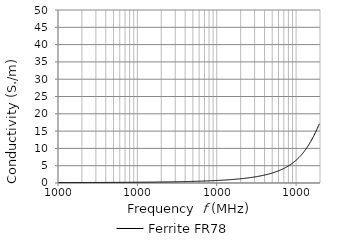
| Category | Ferrite FR78 |
|---|---|
| 10000.0 | 0.139 |
| 10192.3 | 0.14 |
| 10388.3 | 0.14 |
| 10588.1 | 0.14 |
| 10791.8 | 0.14 |
| 10999.3 | 0.14 |
| 11210.9 | 0.14 |
| 11426.5 | 0.141 |
| 11646.2 | 0.141 |
| 11870.2 | 0.141 |
| 12098.5 | 0.141 |
| 12331.2 | 0.141 |
| 12568.4 | 0.142 |
| 12810.1 | 0.142 |
| 13056.5 | 0.142 |
| 13307.6 | 0.142 |
| 13563.5 | 0.143 |
| 13824.4 | 0.143 |
| 14090.2 | 0.143 |
| 14361.2 | 0.143 |
| 14637.4 | 0.144 |
| 14919.0 | 0.144 |
| 15205.9 | 0.144 |
| 15498.3 | 0.144 |
| 15796.4 | 0.145 |
| 16100.2 | 0.145 |
| 16409.9 | 0.145 |
| 16725.5 | 0.146 |
| 17047.1 | 0.146 |
| 17375.0 | 0.146 |
| 17709.2 | 0.147 |
| 18049.7 | 0.147 |
| 18396.9 | 0.147 |
| 18750.7 | 0.148 |
| 19111.3 | 0.148 |
| 19478.9 | 0.148 |
| 19853.5 | 0.149 |
| 20235.3 | 0.149 |
| 20624.5 | 0.15 |
| 21021.2 | 0.15 |
| 21425.5 | 0.15 |
| 21837.5 | 0.151 |
| 22257.5 | 0.151 |
| 22685.6 | 0.152 |
| 23121.9 | 0.152 |
| 23566.6 | 0.153 |
| 24019.8 | 0.153 |
| 24481.8 | 0.154 |
| 24952.6 | 0.154 |
| 25432.5 | 0.155 |
| 25921.7 | 0.155 |
| 26420.2 | 0.156 |
| 26928.3 | 0.156 |
| 27446.2 | 0.157 |
| 27974.1 | 0.157 |
| 28512.1 | 0.158 |
| 29060.5 | 0.158 |
| 29619.4 | 0.159 |
| 30189.0 | 0.159 |
| 30769.6 | 0.16 |
| 31361.4 | 0.16 |
| 31964.6 | 0.161 |
| 32579.3 | 0.162 |
| 33205.9 | 0.162 |
| 33844.5 | 0.163 |
| 34495.4 | 0.164 |
| 35158.9 | 0.164 |
| 35835.1 | 0.165 |
| 36524.3 | 0.166 |
| 37226.7 | 0.166 |
| 37942.7 | 0.167 |
| 38672.4 | 0.168 |
| 39416.2 | 0.168 |
| 40174.3 | 0.169 |
| 40946.9 | 0.17 |
| 41734.4 | 0.171 |
| 42537.1 | 0.171 |
| 43355.2 | 0.172 |
| 44189.0 | 0.173 |
| 45038.9 | 0.174 |
| 45905.1 | 0.175 |
| 46787.9 | 0.175 |
| 47687.8 | 0.176 |
| 48604.9 | 0.177 |
| 49539.7 | 0.178 |
| 50492.5 | 0.179 |
| 51463.6 | 0.18 |
| 52453.4 | 0.181 |
| 53462.2 | 0.182 |
| 54490.4 | 0.183 |
| 55538.4 | 0.184 |
| 56606.5 | 0.185 |
| 57695.2 | 0.186 |
| 58804.8 | 0.187 |
| 59935.8 | 0.188 |
| 61088.5 | 0.189 |
| 62263.4 | 0.19 |
| 63460.9 | 0.191 |
| 64681.4 | 0.192 |
| 65925.4 | 0.193 |
| 67193.3 | 0.194 |
| 68485.6 | 0.195 |
| 69802.7 | 0.196 |
| 71145.2 | 0.198 |
| 72513.5 | 0.199 |
| 73908.1 | 0.2 |
| 75329.5 | 0.201 |
| 76778.3 | 0.202 |
| 78255.0 | 0.204 |
| 79760.0 | 0.205 |
| 81294.0 | 0.206 |
| 82857.5 | 0.207 |
| 84451.0 | 0.209 |
| 86075.2 | 0.21 |
| 87730.7 | 0.211 |
| 89417.9 | 0.213 |
| 91137.7 | 0.214 |
| 92890.5 | 0.216 |
| 94677.0 | 0.217 |
| 96497.9 | 0.219 |
| 98353.8 | 0.22 |
| 100245.0 | 0.221 |
| 102173.0 | 0.223 |
| 104138.0 | 0.224 |
| 106141.0 | 0.226 |
| 108183.0 | 0.228 |
| 110263.0 | 0.229 |
| 112384.0 | 0.231 |
| 114545.0 | 0.232 |
| 116748.0 | 0.234 |
| 118994.0 | 0.236 |
| 121282.0 | 0.238 |
| 123615.0 | 0.239 |
| 125992.0 | 0.241 |
| 128415.0 | 0.243 |
| 130885.0 | 0.245 |
| 133402.0 | 0.246 |
| 135968.0 | 0.249 |
| 138583.0 | 0.25 |
| 141248.0 | 0.252 |
| 143965.0 | 0.254 |
| 146734.0 | 0.256 |
| 149556.0 | 0.258 |
| 152432.0 | 0.26 |
| 155364.0 | 0.262 |
| 158352.0 | 0.264 |
| 161397.0 | 0.266 |
| 164501.0 | 0.269 |
| 167665.0 | 0.271 |
| 170890.0 | 0.273 |
| 174176.0 | 0.275 |
| 177526.0 | 0.277 |
| 180940.0 | 0.28 |
| 184420.0 | 0.282 |
| 187967.0 | 0.285 |
| 191582.0 | 0.287 |
| 195267.0 | 0.289 |
| 199022.0 | 0.292 |
| 202850.0 | 0.294 |
| 206751.0 | 0.297 |
| 210728.0 | 0.3 |
| 214780.0 | 0.302 |
| 218911.0 | 0.305 |
| 223121.0 | 0.307 |
| 227413.0 | 0.31 |
| 231786.0 | 0.313 |
| 236244.0 | 0.316 |
| 240788.0 | 0.319 |
| 245419.0 | 0.322 |
| 250139.0 | 0.324 |
| 254949.0 | 0.327 |
| 259853.0 | 0.33 |
| 264850.0 | 0.333 |
| 269944.0 | 0.337 |
| 275136.0 | 0.34 |
| 280427.0 | 0.343 |
| 285821.0 | 0.346 |
| 291318.0 | 0.349 |
| 296920.0 | 0.353 |
| 302631.0 | 0.356 |
| 308451.0 | 0.36 |
| 314383.0 | 0.363 |
| 320430.0 | 0.367 |
| 326593.0 | 0.37 |
| 332874.0 | 0.374 |
| 339276.0 | 0.378 |
| 345801.0 | 0.381 |
| 352451.0 | 0.385 |
| 359230.0 | 0.389 |
| 366139.0 | 0.393 |
| 373181.0 | 0.397 |
| 380358.0 | 0.401 |
| 387673.0 | 0.405 |
| 395129.0 | 0.409 |
| 402728.0 | 0.414 |
| 410474.0 | 0.418 |
| 418368.0 | 0.422 |
| 426414.0 | 0.427 |
| 434615.0 | 0.431 |
| 442974.0 | 0.436 |
| 451494.0 | 0.441 |
| 460177.0 | 0.445 |
| 469027.0 | 0.45 |
| 478048.0 | 0.455 |
| 487242.0 | 0.46 |
| 496613.0 | 0.465 |
| 506164.0 | 0.47 |
| 515899.0 | 0.475 |
| 525821.0 | 0.48 |
| 535934.0 | 0.486 |
| 546241.0 | 0.491 |
| 556746.0 | 0.497 |
| 567454.0 | 0.502 |
| 578368.0 | 0.508 |
| 589491.0 | 0.514 |
| 600828.0 | 0.52 |
| 612384.0 | 0.526 |
| 624162.0 | 0.532 |
| 636166.0 | 0.538 |
| 648401.0 | 0.544 |
| 660871.0 | 0.551 |
| 673581.0 | 0.557 |
| 686536.0 | 0.564 |
| 699740.0 | 0.571 |
| 713198.0 | 0.578 |
| 726914.0 | 0.585 |
| 740894.0 | 0.592 |
| 755144.0 | 0.599 |
| 769667.0 | 0.606 |
| 784470.0 | 0.614 |
| 799557.0 | 0.621 |
| 814934.0 | 0.629 |
| 830608.0 | 0.637 |
| 846582.0 | 0.645 |
| 862864.0 | 0.653 |
| 879459.0 | 0.662 |
| 896373.0 | 0.67 |
| 913613.0 | 0.679 |
| 931184.0 | 0.687 |
| 949093.0 | 0.696 |
| 967346.0 | 0.705 |
| 985951.0 | 0.715 |
| 1004910.0 | 0.726 |
| 1024240.0 | 0.736 |
| 1043940.0 | 0.746 |
| 1064020.0 | 0.756 |
| 1084480.0 | 0.766 |
| 1105340.0 | 0.777 |
| 1126600.0 | 0.787 |
| 1148260.0 | 0.798 |
| 1170350.0 | 0.809 |
| 1192860.0 | 0.82 |
| 1215800.0 | 0.832 |
| 1239180.0 | 0.844 |
| 1263010.0 | 0.856 |
| 1287300.0 | 0.868 |
| 1312060.0 | 0.88 |
| 1337300.0 | 0.892 |
| 1363010.0 | 0.905 |
| 1389230.0 | 0.919 |
| 1415950.0 | 0.932 |
| 1443180.0 | 0.945 |
| 1470940.0 | 0.959 |
| 1499230.0 | 0.973 |
| 1528060.0 | 0.988 |
| 1557450.0 | 1.003 |
| 1587400.0 | 1.018 |
| 1617930.0 | 1.033 |
| 1649050.0 | 1.049 |
| 1680760.0 | 1.065 |
| 1713090.0 | 1.081 |
| 1746040.0 | 1.098 |
| 1779620.0 | 1.115 |
| 1813840.0 | 1.132 |
| 1848730.0 | 1.15 |
| 1884280.0 | 1.168 |
| 1920520.0 | 1.186 |
| 1957460.0 | 1.205 |
| 1995110.0 | 1.224 |
| 2033480.0 | 1.244 |
| 2072580.0 | 1.264 |
| 2112450.0 | 1.284 |
| 2153070.0 | 1.305 |
| 2194480.0 | 1.326 |
| 2236690.0 | 1.348 |
| 2279700.0 | 1.37 |
| 2323550.0 | 1.392 |
| 2368240.0 | 1.415 |
| 2413780.0 | 1.439 |
| 2460210.0 | 1.463 |
| 2507520.0 | 1.487 |
| 2555750.0 | 1.512 |
| 2604900.0 | 1.538 |
| 2655000.0 | 1.564 |
| 2706060.0 | 1.591 |
| 2758110.0 | 1.618 |
| 2811150.0 | 1.646 |
| 2865220.0 | 1.675 |
| 2920320.0 | 1.704 |
| 2976490.0 | 1.733 |
| 3033730.0 | 1.764 |
| 3092080.0 | 1.796 |
| 3151550.0 | 1.828 |
| 3212160.0 | 1.86 |
| 3273940.0 | 1.893 |
| 3336900.0 | 1.928 |
| 3401080.0 | 1.963 |
| 3466490.0 | 1.998 |
| 3533160.0 | 2.035 |
| 3601110.0 | 2.072 |
| 3670370.0 | 2.11 |
| 3740960.0 | 2.149 |
| 3812910.0 | 2.19 |
| 3886240.0 | 2.231 |
| 3960980.0 | 2.273 |
| 4037160.0 | 2.316 |
| 4114810.0 | 2.36 |
| 4193950.0 | 2.406 |
| 4274610.0 | 2.452 |
| 4356820.0 | 2.5 |
| 4440610.0 | 2.548 |
| 4526010.0 | 2.599 |
| 4613060.0 | 2.65 |
| 4701780.0 | 2.703 |
| 4792210.0 | 2.757 |
| 4884370.0 | 2.812 |
| 4978310.0 | 2.869 |
| 5074060.0 | 2.927 |
| 5171640.0 | 2.987 |
| 5271110.0 | 3.049 |
| 5372480.0 | 3.112 |
| 5475810.0 | 3.178 |
| 5581120.0 | 3.245 |
| 5688460.0 | 3.314 |
| 5797870.0 | 3.384 |
| 5909370.0 | 3.456 |
| 6023030.0 | 3.531 |
| 6138860.0 | 3.607 |
| 6256930.0 | 3.686 |
| 6377270.0 | 3.767 |
| 6499920.0 | 3.85 |
| 6624930.0 | 3.935 |
| 6752340.0 | 4.024 |
| 6882200.0 | 4.114 |
| 7014570.0 | 4.207 |
| 7149470.0 | 4.304 |
| 7286980.0 | 4.403 |
| 7427120.0 | 4.506 |
| 7569960.0 | 4.611 |
| 7715550.0 | 4.719 |
| 7863940.0 | 4.831 |
| 8015190.0 | 4.947 |
| 8169340.0 | 5.067 |
| 8326450.0 | 5.19 |
| 8486590.0 | 5.315 |
| 8649810.0 | 5.444 |
| 8816170.0 | 5.577 |
| 8985730.0 | 5.716 |
| 9158540.0 | 5.86 |
| 9334690.0 | 6.009 |
| 9514210.0 | 6.163 |
| 9697200.0 | 6.321 |
| 9883700.0 | 6.483 |
| 10073800.0 | 6.651 |
| 10267500.0 | 6.824 |
| 10465000.0 | 7.002 |
| 10666300.0 | 7.186 |
| 10871400.0 | 7.374 |
| 11080500.0 | 7.571 |
| 11293600.0 | 7.773 |
| 11510800.0 | 7.982 |
| 11732200.0 | 8.197 |
| 11957800.0 | 8.419 |
| 12187800.0 | 8.646 |
| 12422200.0 | 8.884 |
| 12661100.0 | 9.128 |
| 12904600.0 | 9.379 |
| 13152800.0 | 9.639 |
| 13405800.0 | 9.905 |
| 13663600.0 | 10.179 |
| 13926400.0 | 10.463 |
| 14194200.0 | 10.754 |
| 14467200.0 | 11.055 |
| 14745400.0 | 11.363 |
| 15029000.0 | 11.71 |
| 15318100.0 | 12.037 |
| 15612700.0 | 12.371 |
| 15913000.0 | 12.716 |
| 16219000.0 | 13.071 |
| 16530900.0 | 13.436 |
| 16848900.0 | 13.807 |
| 17172900.0 | 14.19 |
| 17503200.0 | 14.581 |
| 17839800.0 | 14.978 |
| 18182900.0 | 15.386 |
| 18532600.0 | 15.807 |
| 18889100.0 | 16.231 |
| 19252300.0 | 16.666 |
| 19622600.0 | 17.107 |